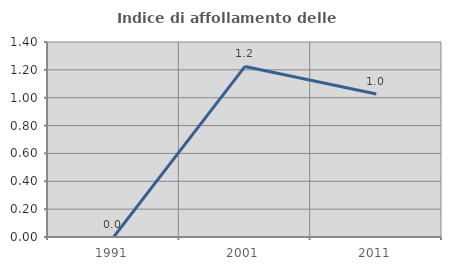
| Category | Indice di affollamento delle abitazioni  |
|---|---|
| 1991.0 | 0 |
| 2001.0 | 1.224 |
| 2011.0 | 1.027 |